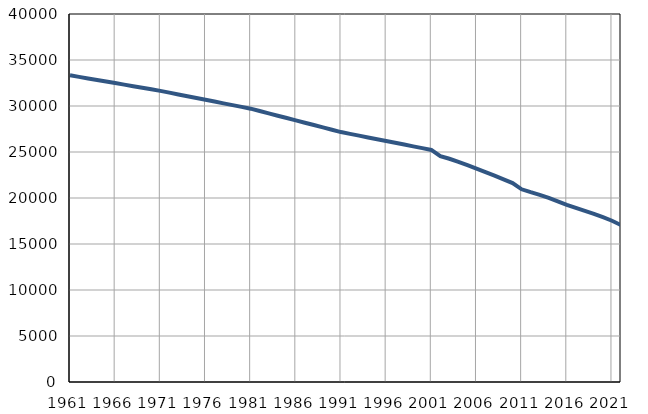
| Category | Population
size |
|---|---|
| 1961.0 | 33336 |
| 1962.0 | 33166 |
| 1963.0 | 32998 |
| 1964.0 | 32829 |
| 1965.0 | 32660 |
| 1966.0 | 32491 |
| 1967.0 | 32322 |
| 1968.0 | 32153 |
| 1969.0 | 31984 |
| 1970.0 | 31815 |
| 1971.0 | 31646 |
| 1972.0 | 31452 |
| 1973.0 | 31258 |
| 1974.0 | 31065 |
| 1975.0 | 30871 |
| 1976.0 | 30676 |
| 1977.0 | 30483 |
| 1978.0 | 30289 |
| 1979.0 | 30095 |
| 1980.0 | 29902 |
| 1981.0 | 29708 |
| 1982.0 | 29453 |
| 1983.0 | 29200 |
| 1984.0 | 28945 |
| 1985.0 | 28691 |
| 1986.0 | 28437 |
| 1987.0 | 28183 |
| 1988.0 | 27929 |
| 1989.0 | 27675 |
| 1990.0 | 27421 |
| 1991.0 | 27167 |
| 1992.0 | 26973 |
| 1993.0 | 26779 |
| 1994.0 | 26584 |
| 1995.0 | 26390 |
| 1996.0 | 26196 |
| 1997.0 | 26001 |
| 1998.0 | 25808 |
| 1999.0 | 25613 |
| 2000.0 | 25418 |
| 2001.0 | 25225 |
| 2002.0 | 24552 |
| 2003.0 | 24263 |
| 2004.0 | 23937 |
| 2005.0 | 23572 |
| 2006.0 | 23189 |
| 2007.0 | 22810 |
| 2008.0 | 22426 |
| 2009.0 | 22015 |
| 2010.0 | 21617 |
| 2011.0 | 20948 |
| 2012.0 | 20631 |
| 2013.0 | 20344 |
| 2014.0 | 20012 |
| 2015.0 | 19625 |
| 2016.0 | 19255 |
| 2017.0 | 18918 |
| 2018.0 | 18602 |
| 2019.0 | 18278 |
| 2020.0 | 17915 |
| 2021.0 | 17529 |
| 2022.0 | 17057 |